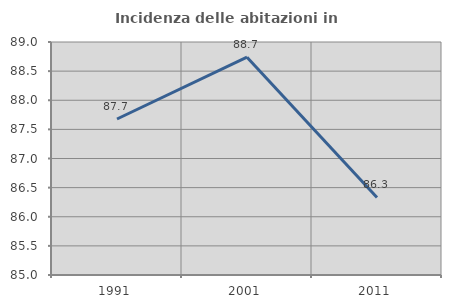
| Category | Incidenza delle abitazioni in proprietà  |
|---|---|
| 1991.0 | 87.678 |
| 2001.0 | 88.74 |
| 2011.0 | 86.331 |